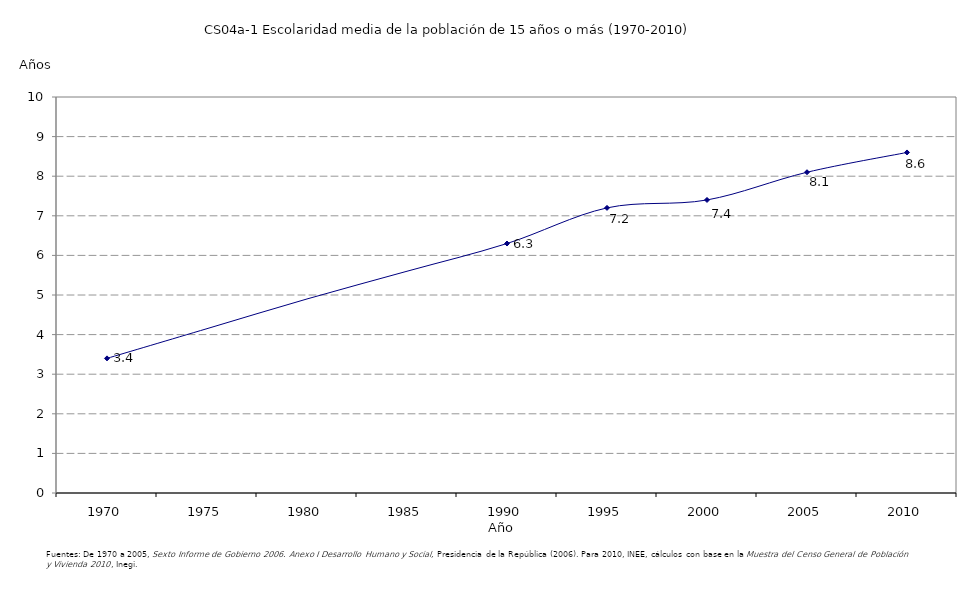
| Category | Series 0 |
|---|---|
| 1970.0 | 3.4 |
| 1975.0 | 4.15 |
| 1980.0 | 4.9 |
| 1985.0 | 5.6 |
| 1990.0 | 6.3 |
| 1995.0 | 7.2 |
| 2000.0 | 7.4 |
| 2005.0 | 8.1 |
| 2010.0 | 8.6 |